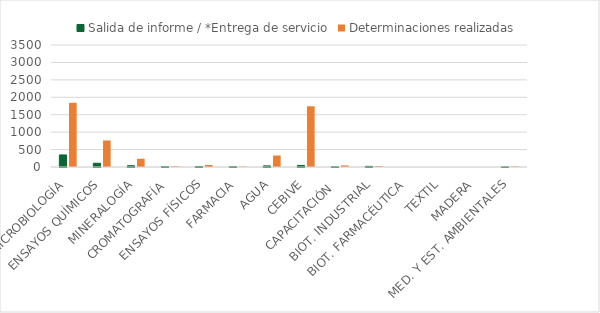
| Category | Salida de informe / *Entrega de servicio | Determinaciones realizadas |
|---|---|---|
| MICROBIOLOGÍA | 346 | 1840 |
| ENSAYOS QUÍMICOS | 108 | 760 |
| MINERALOGÍA | 37 | 236 |
| CROMATOGRAFÍA | 10 | 22 |
| ENSAYOS FÍSICOS | 15 | 58 |
| FARMACIA | 8 | 11 |
| AGUA | 31 | 329 |
| CEBIVE | 44 | 1742 |
| CAPACITACIÓN  | 6 | 45 |
| BIOT. INDUSTRIAL | 18 | 26 |
| BIOT. FARMACÉUTICA | 0 | 0 |
| TEXTIL | 0 | 0 |
| MADERA | 0 | 0 |
| MED. Y EST. AMBIENTALES | 3 | 16 |